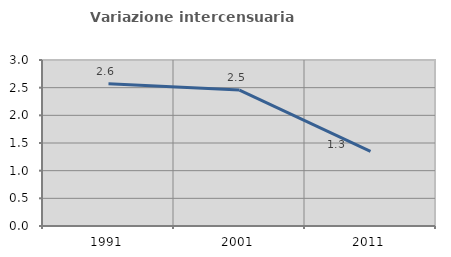
| Category | Variazione intercensuaria annua |
|---|---|
| 1991.0 | 2.571 |
| 2001.0 | 2.456 |
| 2011.0 | 1.347 |